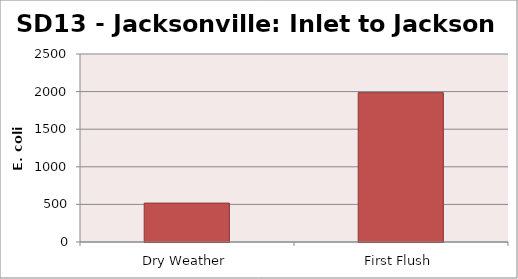
| Category | E. coli MPN |
|---|---|
| Dry Weather | 517.2 |
| First Flush | 1986.3 |